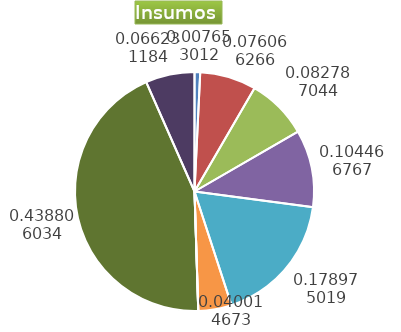
| Category | Series 0 |
|---|---|
| Control arvenses | 248964 |
| Control fitosanitario | 2474550 |
| Cosecha y beneficio | 2693186.999 |
| Fertilización | 3398461 |
| Instalación | 5822326.437 |
| Otros | 1464395 |
| Podas | 0 |
| Riego | 0 |
| Transporte | 14275020 |
| Tutorado | 2154600 |